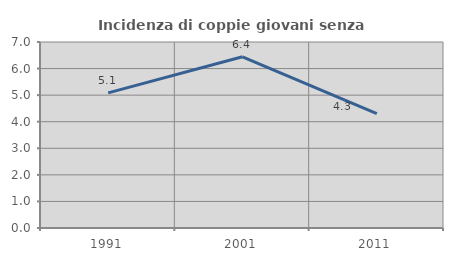
| Category | Incidenza di coppie giovani senza figli |
|---|---|
| 1991.0 | 5.085 |
| 2001.0 | 6.444 |
| 2011.0 | 4.301 |